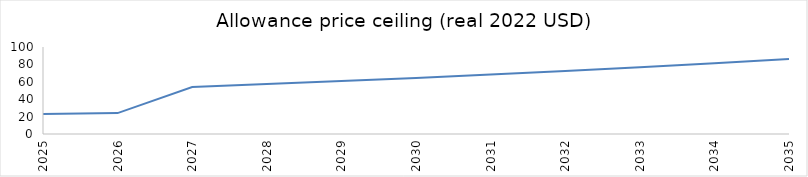
| Category | Series 0 |
|---|---|
| 2025.0 | 22.889 |
| 2026.0 | 24.033 |
| 2027.0 | 54.101 |
| 2028.0 | 57.347 |
| 2029.0 | 60.788 |
| 2030.0 | 64.435 |
| 2031.0 | 68.301 |
| 2032.0 | 72.399 |
| 2033.0 | 76.743 |
| 2034.0 | 81.348 |
| 2035.0 | 86.228 |